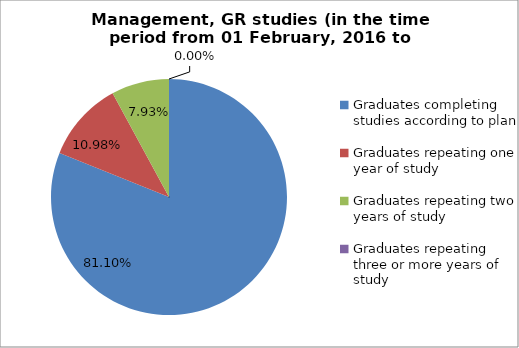
| Category | Series 0 |
|---|---|
| Graduates completing studies according to plan | 81.098 |
| Graduates repeating one year of study | 10.976 |
| Graduates repeating two years of study | 7.927 |
| Graduates repeating three or more years of study | 0 |